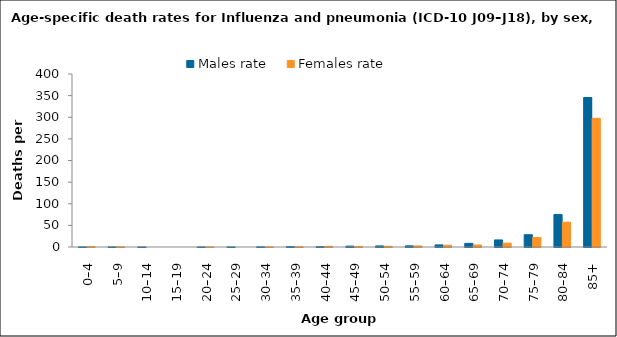
| Category | Males rate | Females rate |
|---|---|---|
| 0–4 | 0.129 | 0.544 |
| 5–9 | 0.241 | 0.256 |
| 10–14 | 0.119 | 0 |
| 15–19 | 0 | 0 |
| 20–24 | 0.118 | 0.126 |
| 25–29 | 0.216 | 0 |
| 30–34 | 0.317 | 0.207 |
| 35–39 | 0.957 | 0.419 |
| 40–44 | 0.832 | 1.39 |
| 45–49 | 1.992 | 0.854 |
| 50–54 | 2.457 | 1.548 |
| 55–59 | 2.651 | 2.435 |
| 60–64 | 4.824 | 4.042 |
| 65–69 | 8.449 | 4.736 |
| 70–74 | 16.329 | 8.926 |
| 75–79 | 28.423 | 22.018 |
| 80–84 | 75.302 | 57.342 |
| 85+ | 345.66 | 297.562 |